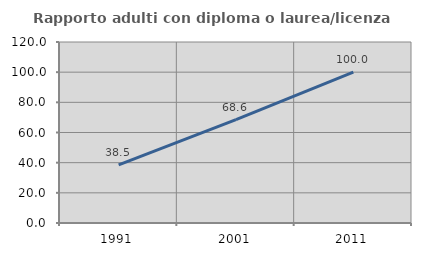
| Category | Rapporto adulti con diploma o laurea/licenza media  |
|---|---|
| 1991.0 | 38.532 |
| 2001.0 | 68.595 |
| 2011.0 | 100 |